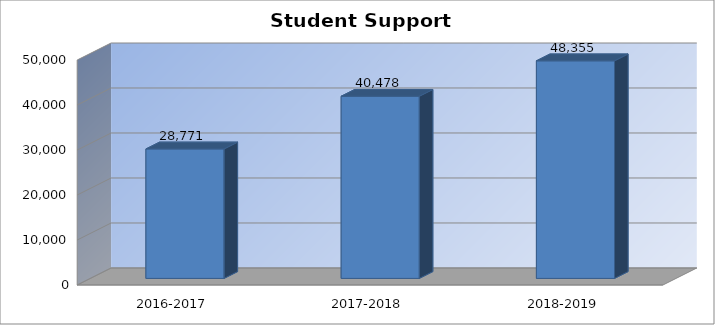
| Category | Student Support Expenditures |
|---|---|
| 2016-2017 | 28771 |
| 2017-2018 | 40478 |
| 2018-2019 | 48355 |